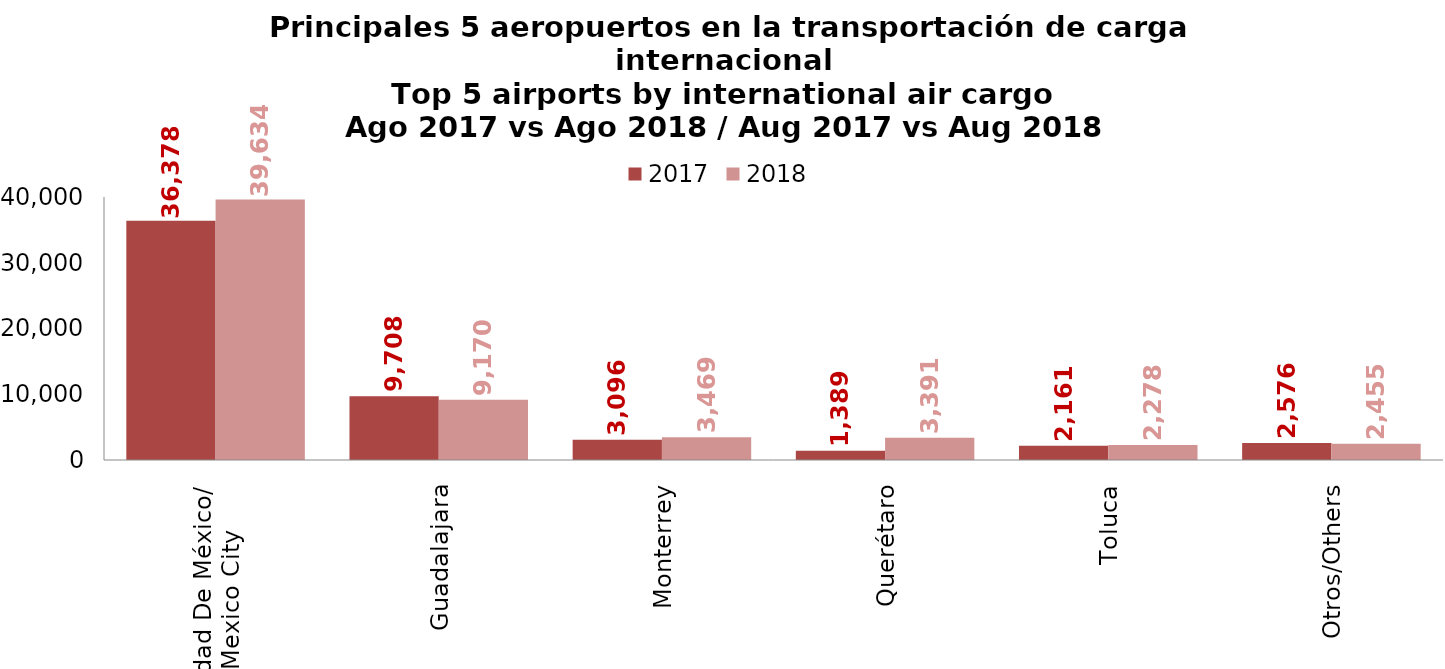
| Category | 2017 | 2018 |
|---|---|---|
| Ciudad De México/
Mexico City | 36377.96 | 39634.35 |
| Guadalajara | 9708.073 | 9170.488 |
| Monterrey | 3095.629 | 3469.446 |
| Querétaro | 1389.311 | 3391.086 |
| Toluca | 2160.959 | 2277.742 |
| Otros/Others | 2575.834 | 2454.918 |